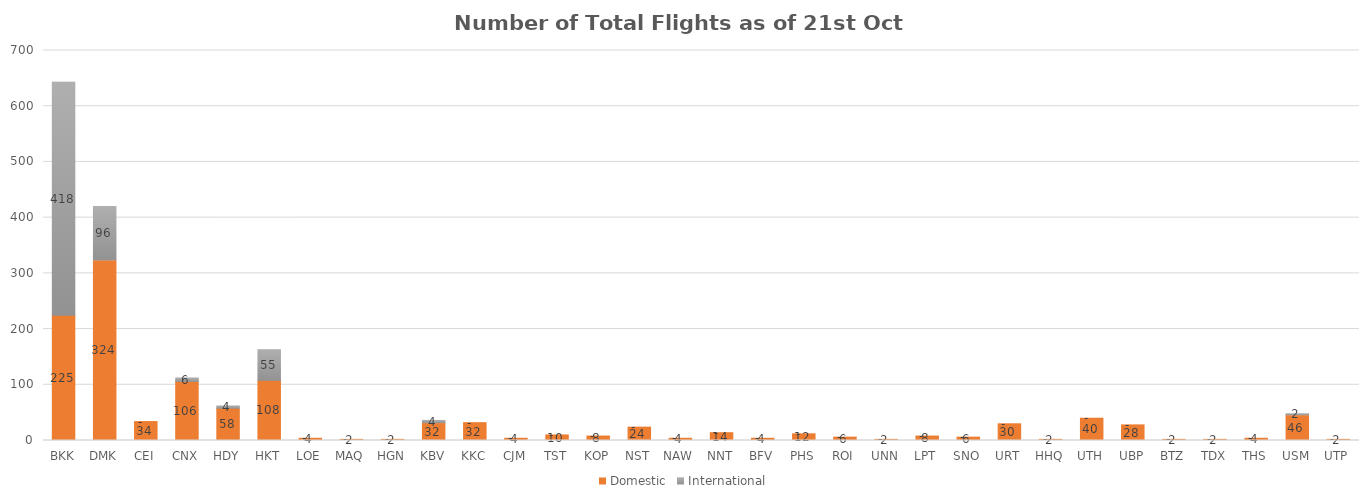
| Category | Domestic | International |
|---|---|---|
| BKK | 225 | 418 |
| DMK | 324 | 96 |
| CEI | 34 | 0 |
| CNX | 106 | 6 |
| HDY | 58 | 4 |
| HKT | 108 | 55 |
| LOE | 4 | 0 |
| MAQ | 2 | 0 |
| HGN | 2 | 0 |
| KBV | 32 | 4 |
| KKC | 32 | 0 |
| CJM | 4 | 0 |
| TST | 10 | 0 |
| KOP | 8 | 0 |
| NST | 24 | 0 |
| NAW | 4 | 0 |
| NNT | 14 | 0 |
| BFV | 4 | 0 |
| PHS | 12 | 0 |
| ROI | 6 | 0 |
| UNN | 2 | 0 |
| LPT | 8 | 0 |
| SNO | 6 | 0 |
| URT | 30 | 0 |
| HHQ | 2 | 0 |
| UTH | 40 | 0 |
| UBP | 28 | 0 |
| BTZ | 2 | 0 |
| TDX | 2 | 0 |
| THS | 4 | 0 |
| USM | 46 | 2 |
| UTP | 2 | 0 |